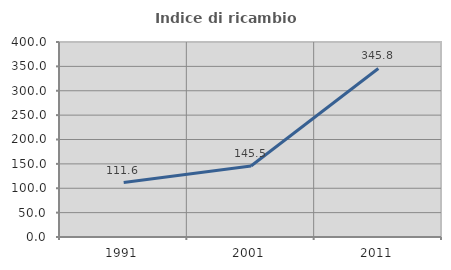
| Category | Indice di ricambio occupazionale  |
|---|---|
| 1991.0 | 111.589 |
| 2001.0 | 145.509 |
| 2011.0 | 345.763 |